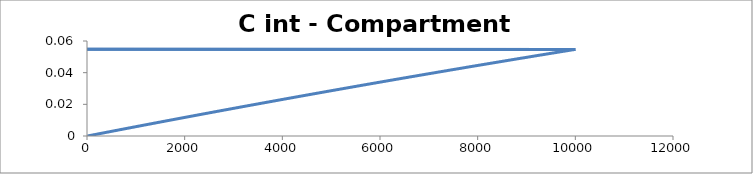
| Category | C - Sys 2 |
|---|---|
| 10.0 | 0 |
| 20.0 | 0 |
| 30.0 | 0 |
| 40.0 | 0 |
| 50.0 | 0 |
| 60.0 | 0 |
| 70.0 | 0 |
| 80.0 | 0 |
| 90.00000000000001 | 0 |
| 100.0 | 0.001 |
| 110.0 | 0.001 |
| 120.0 | 0.001 |
| 130.0 | 0.001 |
| 140.0 | 0.001 |
| 150.0 | 0.001 |
| 160.0 | 0.001 |
| 170.0 | 0.001 |
| 180.00000000000003 | 0.001 |
| 190.0 | 0.001 |
| 200.0 | 0.001 |
| 210.0 | 0.001 |
| 220.0 | 0.001 |
| 230.0 | 0.001 |
| 240.0 | 0.001 |
| 250.0 | 0.001 |
| 260.0 | 0.001 |
| 270.0 | 0.002 |
| 280.0 | 0.002 |
| 290.0 | 0.002 |
| 300.0 | 0.002 |
| 310.0 | 0.002 |
| 320.0 | 0.002 |
| 330.0 | 0.002 |
| 340.0 | 0.002 |
| 350.00000000000006 | 0.002 |
| 360.00000000000006 | 0.002 |
| 370.0 | 0.002 |
| 380.0 | 0.002 |
| 390.0 | 0.002 |
| 400.0 | 0.002 |
| 410.0 | 0.002 |
| 420.0 | 0.002 |
| 430.00000000000006 | 0.003 |
| 440.0 | 0.003 |
| 450.0 | 0.003 |
| 460.0 | 0.003 |
| 470.0 | 0.003 |
| 480.0 | 0.003 |
| 490.0 | 0.003 |
| 500.0 | 0.003 |
| 510.00000000000006 | 0.003 |
| 520.0 | 0.003 |
| 530.0 | 0.003 |
| 540.0 | 0.003 |
| 550.0 | 0.003 |
| 560.0 | 0.003 |
| 570.0 | 0.003 |
| 580.0 | 0.003 |
| 590.0 | 0.003 |
| 600.0 | 0.004 |
| 610.0 | 0.004 |
| 620.0 | 0.004 |
| 630.0 | 0.004 |
| 640.0 | 0.004 |
| 650.0 | 0.004 |
| 660.0 | 0.004 |
| 670.0 | 0.004 |
| 680.0 | 0.004 |
| 690.0000000000001 | 0.004 |
| 700.0000000000001 | 0.004 |
| 710.0000000000001 | 0.004 |
| 720.0000000000001 | 0.004 |
| 730.0 | 0.004 |
| 740.0 | 0.004 |
| 750.0 | 0.004 |
| 760.0 | 0.004 |
| 770.0 | 0.005 |
| 780.0 | 0.005 |
| 790.0 | 0.005 |
| 800.0 | 0.005 |
| 810.0 | 0.005 |
| 820.0 | 0.005 |
| 830.0 | 0.005 |
| 840.0 | 0.005 |
| 850.0000000000001 | 0.005 |
| 860.0000000000001 | 0.005 |
| 870.0000000000001 | 0.005 |
| 880.0 | 0.005 |
| 890.0 | 0.005 |
| 900.0 | 0.005 |
| 910.0 | 0.005 |
| 920.0 | 0.005 |
| 930.0 | 0.005 |
| 940.0 | 0.006 |
| 950.0 | 0.006 |
| 960.0 | 0.006 |
| 970.0 | 0.006 |
| 980.0 | 0.006 |
| 990.0 | 0.006 |
| 1000.0 | 0.006 |
| 1010.0000000000001 | 0.006 |
| 1020.0000000000001 | 0.006 |
| 1030.0 | 0.006 |
| 1040.0 | 0.006 |
| 1050.0 | 0.006 |
| 1060.0 | 0.006 |
| 1070.0 | 0.006 |
| 1080.0 | 0.006 |
| 1090.0 | 0.006 |
| 1100.0 | 0.006 |
| 1110.0 | 0.007 |
| 1120.0 | 0.007 |
| 1130.0 | 0.007 |
| 1140.0 | 0.007 |
| 1150.0 | 0.007 |
| 1160.0 | 0.007 |
| 1170.0 | 0.007 |
| 1180.0 | 0.007 |
| 1190.0 | 0.007 |
| 1200.0 | 0.007 |
| 1210.0 | 0.007 |
| 1220.0 | 0.007 |
| 1230.0 | 0.007 |
| 1240.0 | 0.007 |
| 1250.0 | 0.007 |
| 1260.0 | 0.007 |
| 1270.0 | 0.007 |
| 1280.0 | 0.008 |
| 1290.0 | 0.008 |
| 1300.0 | 0.008 |
| 1310.0 | 0.008 |
| 1320.0 | 0.008 |
| 1330.0 | 0.008 |
| 1340.0 | 0.008 |
| 1350.0 | 0.008 |
| 1360.0 | 0.008 |
| 1370.0 | 0.008 |
| 1380.0000000000002 | 0.008 |
| 1390.0000000000002 | 0.008 |
| 1400.0000000000002 | 0.008 |
| 1410.0000000000002 | 0.008 |
| 1420.0000000000002 | 0.008 |
| 1430.0000000000002 | 0.008 |
| 1440.0000000000002 | 0.008 |
| 1450.0 | 0.009 |
| 1460.0 | 0.009 |
| 1470.0 | 0.009 |
| 1480.0 | 0.009 |
| 1490.0 | 0.009 |
| 1500.0 | 0.009 |
| 1510.0 | 0.009 |
| 1520.0 | 0.009 |
| 1530.0 | 0.009 |
| 1540.0 | 0.009 |
| 1550.0 | 0.009 |
| 1560.0 | 0.009 |
| 1570.0 | 0.009 |
| 1580.0 | 0.009 |
| 1590.0 | 0.009 |
| 1600.0 | 0.009 |
| 1610.0 | 0.009 |
| 1620.0 | 0.01 |
| 1630.0 | 0.01 |
| 1640.0 | 0.01 |
| 1650.0 | 0.01 |
| 1660.0 | 0.01 |
| 1670.0 | 0.01 |
| 1680.0 | 0.01 |
| 1690.0 | 0.01 |
| 1700.0000000000002 | 0.01 |
| 1710.0000000000002 | 0.01 |
| 1720.0000000000002 | 0.01 |
| 1730.0000000000002 | 0.01 |
| 1740.0000000000002 | 0.01 |
| 1750.0000000000002 | 0.01 |
| 1760.0 | 0.01 |
| 1770.0 | 0.01 |
| 1780.0 | 0.01 |
| 1790.0 | 0.011 |
| 1800.0 | 0.011 |
| 1810.0 | 0.011 |
| 1820.0 | 0.011 |
| 1830.0 | 0.011 |
| 1840.0 | 0.011 |
| 1850.0 | 0.011 |
| 1860.0 | 0.011 |
| 1870.0 | 0.011 |
| 1880.0 | 0.011 |
| 1890.0 | 0.011 |
| 1900.0 | 0.011 |
| 1910.0 | 0.011 |
| 1920.0 | 0.011 |
| 1930.0 | 0.011 |
| 1940.0 | 0.011 |
| 1950.0 | 0.011 |
| 1960.0 | 0.011 |
| 1970.0 | 0.012 |
| 1980.0 | 0.012 |
| 1990.0 | 0.012 |
| 2000.0 | 0.012 |
| 2010.0000000000002 | 0.012 |
| 2020.0000000000002 | 0.012 |
| 2030.0000000000002 | 0.012 |
| 2040.0000000000002 | 0.012 |
| 2050.0 | 0.012 |
| 2060.0 | 0.012 |
| 2070.0 | 0.012 |
| 2080.0 | 0.012 |
| 2090.0 | 0.012 |
| 2100.0 | 0.012 |
| 2110.0 | 0.012 |
| 2120.0 | 0.012 |
| 2130.0 | 0.012 |
| 2140.0 | 0.013 |
| 2150.0 | 0.013 |
| 2160.0 | 0.013 |
| 2170.0 | 0.013 |
| 2180.0 | 0.013 |
| 2190.0 | 0.013 |
| 2200.0 | 0.013 |
| 2210.0 | 0.013 |
| 2220.0 | 0.013 |
| 2230.0 | 0.013 |
| 2240.0 | 0.013 |
| 2250.0 | 0.013 |
| 2260.0 | 0.013 |
| 2270.0 | 0.013 |
| 2280.0 | 0.013 |
| 2290.0 | 0.013 |
| 2300.0 | 0.013 |
| 2310.0 | 0.014 |
| 2320.0 | 0.014 |
| 2330.0 | 0.014 |
| 2340.0 | 0.014 |
| 2350.0 | 0.014 |
| 2360.0 | 0.014 |
| 2370.0 | 0.014 |
| 2380.0 | 0.014 |
| 2390.0 | 0.014 |
| 2400.0 | 0.014 |
| 2410.0 | 0.014 |
| 2420.0 | 0.014 |
| 2430.0 | 0.014 |
| 2440.0 | 0.014 |
| 2450.0 | 0.014 |
| 2460.0 | 0.014 |
| 2470.0 | 0.014 |
| 2480.0 | 0.014 |
| 2490.0 | 0.015 |
| 2500.0 | 0.015 |
| 2510.0 | 0.015 |
| 2520.0 | 0.015 |
| 2530.0 | 0.015 |
| 2540.0 | 0.015 |
| 2550.0 | 0.015 |
| 2560.0 | 0.015 |
| 2570.0 | 0.015 |
| 2580.0 | 0.015 |
| 2590.0 | 0.015 |
| 2600.0 | 0.015 |
| 2610.0 | 0.015 |
| 2620.0 | 0.015 |
| 2630.0 | 0.015 |
| 2640.0 | 0.015 |
| 2650.0 | 0.015 |
| 2660.0 | 0.016 |
| 2670.0 | 0.016 |
| 2680.0 | 0.016 |
| 2690.0 | 0.016 |
| 2700.0 | 0.016 |
| 2710.0 | 0.016 |
| 2720.0 | 0.016 |
| 2730.0 | 0.016 |
| 2740.0 | 0.016 |
| 2750.0 | 0.016 |
| 2760.0000000000005 | 0.016 |
| 2770.0000000000005 | 0.016 |
| 2780.0000000000005 | 0.016 |
| 2790.0000000000005 | 0.016 |
| 2800.0000000000005 | 0.016 |
| 2810.0000000000005 | 0.016 |
| 2820.0000000000005 | 0.016 |
| 2830.0000000000005 | 0.016 |
| 2840.0000000000005 | 0.017 |
| 2850.0000000000005 | 0.017 |
| 2860.0000000000005 | 0.017 |
| 2870.0000000000005 | 0.017 |
| 2880.0000000000005 | 0.017 |
| 2890.0 | 0.017 |
| 2900.0 | 0.017 |
| 2910.0 | 0.017 |
| 2920.0 | 0.017 |
| 2930.0 | 0.017 |
| 2940.0 | 0.017 |
| 2950.0 | 0.017 |
| 2960.0 | 0.017 |
| 2970.0 | 0.017 |
| 2980.0 | 0.017 |
| 2990.0 | 0.017 |
| 3000.0 | 0.017 |
| 3010.0 | 0.018 |
| 3020.0 | 0.018 |
| 3030.0 | 0.018 |
| 3040.0 | 0.018 |
| 3050.0 | 0.018 |
| 3060.0 | 0.018 |
| 3070.0 | 0.018 |
| 3080.0 | 0.018 |
| 3090.0 | 0.018 |
| 3100.0 | 0.018 |
| 3110.0 | 0.018 |
| 3120.0 | 0.018 |
| 3130.0 | 0.018 |
| 3140.0 | 0.018 |
| 3150.0 | 0.018 |
| 3160.0 | 0.018 |
| 3170.0 | 0.018 |
| 3180.0 | 0.018 |
| 3190.0 | 0.019 |
| 3200.0 | 0.019 |
| 3210.0 | 0.019 |
| 3220.0 | 0.019 |
| 3230.0 | 0.019 |
| 3240.0 | 0.019 |
| 3250.0 | 0.019 |
| 3260.0 | 0.019 |
| 3270.0 | 0.019 |
| 3280.0 | 0.019 |
| 3290.0 | 0.019 |
| 3300.0 | 0.019 |
| 3310.0 | 0.019 |
| 3320.0 | 0.019 |
| 3330.0 | 0.019 |
| 3340.0 | 0.019 |
| 3350.0 | 0.019 |
| 3360.0 | 0.019 |
| 3370.0 | 0.02 |
| 3380.0 | 0.02 |
| 3390.0000000000005 | 0.02 |
| 3400.0000000000005 | 0.02 |
| 3410.0000000000005 | 0.02 |
| 3420.0000000000005 | 0.02 |
| 3430.0000000000005 | 0.02 |
| 3440.0000000000005 | 0.02 |
| 3450.0000000000005 | 0.02 |
| 3460.0000000000005 | 0.02 |
| 3470.0000000000005 | 0.02 |
| 3480.0000000000005 | 0.02 |
| 3490.0000000000005 | 0.02 |
| 3500.0000000000005 | 0.02 |
| 3510.0000000000005 | 0.02 |
| 3520.0 | 0.02 |
| 3530.0 | 0.02 |
| 3540.0 | 0.021 |
| 3550.0 | 0.021 |
| 3560.0 | 0.021 |
| 3570.0 | 0.021 |
| 3580.0 | 0.021 |
| 3590.0 | 0.021 |
| 3600.0 | 0.021 |
| 3610.0 | 0.021 |
| 3620.0 | 0.021 |
| 3630.0 | 0.021 |
| 3640.0 | 0.021 |
| 3650.0 | 0.021 |
| 3660.0 | 0.021 |
| 3670.0 | 0.021 |
| 3680.0 | 0.021 |
| 3690.0 | 0.021 |
| 3700.0 | 0.021 |
| 3710.0 | 0.021 |
| 3720.0 | 0.022 |
| 3730.0 | 0.022 |
| 3740.0 | 0.022 |
| 3750.0 | 0.022 |
| 3760.0 | 0.022 |
| 3770.0 | 0.022 |
| 3780.0 | 0.022 |
| 3790.0 | 0.022 |
| 3800.0 | 0.022 |
| 3810.0 | 0.022 |
| 3820.0 | 0.022 |
| 3830.0 | 0.022 |
| 3840.0 | 0.022 |
| 3850.0 | 0.022 |
| 3860.0 | 0.022 |
| 3870.0 | 0.022 |
| 3880.0 | 0.022 |
| 3890.0 | 0.022 |
| 3900.0 | 0.023 |
| 3910.0 | 0.023 |
| 3920.0 | 0.023 |
| 3930.0 | 0.023 |
| 3940.0 | 0.023 |
| 3950.0 | 0.023 |
| 3960.0 | 0.023 |
| 3970.0 | 0.023 |
| 3980.0 | 0.023 |
| 3990.0 | 0.023 |
| 4000.0 | 0.023 |
| 4010.0000000000005 | 0.023 |
| 4020.0000000000005 | 0.023 |
| 4030.0000000000005 | 0.023 |
| 4040.0000000000005 | 0.023 |
| 4050.0000000000005 | 0.023 |
| 4060.0000000000005 | 0.023 |
| 4070.0000000000005 | 0.023 |
| 4080.0000000000005 | 0.024 |
| 4090.0000000000005 | 0.024 |
| 4100.0 | 0.024 |
| 4110.0 | 0.024 |
| 4120.0 | 0.024 |
| 4130.0 | 0.024 |
| 4140.0 | 0.024 |
| 4150.0 | 0.024 |
| 4160.0 | 0.024 |
| 4170.0 | 0.024 |
| 4180.0 | 0.024 |
| 4190.0 | 0.024 |
| 4200.0 | 0.024 |
| 4210.0 | 0.024 |
| 4220.0 | 0.024 |
| 4230.0 | 0.024 |
| 4240.0 | 0.024 |
| 4250.0 | 0.024 |
| 4260.0 | 0.025 |
| 4270.0 | 0.025 |
| 4280.0 | 0.025 |
| 4290.0 | 0.025 |
| 4300.0 | 0.025 |
| 4310.0 | 0.025 |
| 4320.0 | 0.025 |
| 4330.0 | 0.025 |
| 4340.0 | 0.025 |
| 4350.0 | 0.025 |
| 4360.0 | 0.025 |
| 4370.0 | 0.025 |
| 4380.0 | 0.025 |
| 4390.0 | 0.025 |
| 4400.0 | 0.025 |
| 4410.0 | 0.025 |
| 4420.0 | 0.025 |
| 4430.0 | 0.025 |
| 4440.0 | 0.026 |
| 4450.0 | 0.026 |
| 4460.0 | 0.026 |
| 4470.0 | 0.026 |
| 4480.0 | 0.026 |
| 4490.0 | 0.026 |
| 4500.0 | 0.026 |
| 4510.0 | 0.026 |
| 4520.0 | 0.026 |
| 4530.0 | 0.026 |
| 4540.0 | 0.026 |
| 4550.0 | 0.026 |
| 4560.0 | 0.026 |
| 4570.0 | 0.026 |
| 4580.0 | 0.026 |
| 4590.0 | 0.026 |
| 4600.0 | 0.026 |
| 4610.0 | 0.026 |
| 4620.0 | 0.027 |
| 4630.0 | 0.027 |
| 4640.0 | 0.027 |
| 4650.0 | 0.027 |
| 4660.0 | 0.027 |
| 4670.0 | 0.027 |
| 4680.0 | 0.027 |
| 4690.0 | 0.027 |
| 4700.0 | 0.027 |
| 4710.0 | 0.027 |
| 4720.0 | 0.027 |
| 4730.0 | 0.027 |
| 4740.0 | 0.027 |
| 4750.0 | 0.027 |
| 4760.0 | 0.027 |
| 4770.0 | 0.027 |
| 4780.0 | 0.027 |
| 4790.0 | 0.027 |
| 4800.0 | 0.027 |
| 4810.0 | 0.028 |
| 4820.0 | 0.028 |
| 4830.0 | 0.028 |
| 4840.0 | 0.028 |
| 4850.0 | 0.028 |
| 4860.0 | 0.028 |
| 4870.0 | 0.028 |
| 4880.0 | 0.028 |
| 4890.0 | 0.028 |
| 4900.0 | 0.028 |
| 4910.0 | 0.028 |
| 4920.0 | 0.028 |
| 4930.0 | 0.028 |
| 4940.0 | 0.028 |
| 4950.0 | 0.028 |
| 4960.0 | 0.028 |
| 4970.0 | 0.028 |
| 4980.0 | 0.028 |
| 4990.0 | 0.029 |
| 5000.0 | 0.029 |
| 5010.0 | 0.029 |
| 5020.0 | 0.029 |
| 5030.0 | 0.029 |
| 5040.0 | 0.029 |
| 5050.0 | 0.029 |
| 5060.0 | 0.029 |
| 5070.0 | 0.029 |
| 5080.0 | 0.029 |
| 5090.0 | 0.029 |
| 5100.0 | 0.029 |
| 5110.0 | 0.029 |
| 5120.0 | 0.029 |
| 5130.0 | 0.029 |
| 5140.0 | 0.029 |
| 5150.0 | 0.029 |
| 5160.0 | 0.029 |
| 5170.0 | 0.03 |
| 5180.0 | 0.03 |
| 5190.0 | 0.03 |
| 5200.0 | 0.03 |
| 5210.0 | 0.03 |
| 5220.0 | 0.03 |
| 5230.0 | 0.03 |
| 5240.0 | 0.03 |
| 5250.0 | 0.03 |
| 5260.0 | 0.03 |
| 5270.0 | 0.03 |
| 5280.0 | 0.03 |
| 5290.0 | 0.03 |
| 5300.0 | 0.03 |
| 5310.0 | 0.03 |
| 5320.0 | 0.03 |
| 5330.0 | 0.03 |
| 5340.0 | 0.03 |
| 5350.0 | 0.031 |
| 5360.0 | 0.031 |
| 5370.0 | 0.031 |
| 5380.0 | 0.031 |
| 5390.0 | 0.031 |
| 5400.0 | 0.031 |
| 5410.0 | 0.031 |
| 5420.0 | 0.031 |
| 5430.0 | 0.031 |
| 5440.0 | 0.031 |
| 5450.0 | 0.031 |
| 5460.0 | 0.031 |
| 5470.0 | 0.031 |
| 5480.0 | 0.031 |
| 5490.0 | 0.031 |
| 5500.0 | 0.031 |
| 5510.0 | 0.031 |
| 5520.000000000001 | 0.031 |
| 5530.000000000001 | 0.031 |
| 5540.000000000001 | 0.032 |
| 5550.000000000001 | 0.032 |
| 5560.000000000001 | 0.032 |
| 5570.000000000001 | 0.032 |
| 5580.000000000001 | 0.032 |
| 5590.000000000001 | 0.032 |
| 5600.000000000001 | 0.032 |
| 5610.000000000001 | 0.032 |
| 5620.000000000001 | 0.032 |
| 5630.000000000001 | 0.032 |
| 5640.000000000001 | 0.032 |
| 5650.000000000001 | 0.032 |
| 5660.000000000001 | 0.032 |
| 5670.000000000001 | 0.032 |
| 5680.000000000001 | 0.032 |
| 5690.000000000001 | 0.032 |
| 5700.000000000001 | 0.032 |
| 5710.000000000001 | 0.032 |
| 5720.000000000001 | 0.033 |
| 5730.000000000001 | 0.033 |
| 5740.000000000001 | 0.033 |
| 5750.000000000001 | 0.033 |
| 5760.000000000001 | 0.033 |
| 5770.0 | 0.033 |
| 5780.0 | 0.033 |
| 5790.0 | 0.033 |
| 5800.0 | 0.033 |
| 5810.0 | 0.033 |
| 5820.0 | 0.033 |
| 5830.0 | 0.033 |
| 5840.0 | 0.033 |
| 5850.0 | 0.033 |
| 5860.0 | 0.033 |
| 5870.0 | 0.033 |
| 5880.0 | 0.033 |
| 5890.0 | 0.033 |
| 5900.0 | 0.033 |
| 5910.0 | 0.034 |
| 5920.0 | 0.034 |
| 5930.0 | 0.034 |
| 5940.0 | 0.034 |
| 5950.0 | 0.034 |
| 5960.0 | 0.034 |
| 5970.0 | 0.034 |
| 5980.0 | 0.034 |
| 5990.0 | 0.034 |
| 6000.0 | 0.034 |
| 6010.0 | 0.034 |
| 6020.0 | 0.034 |
| 6030.0 | 0.034 |
| 6040.0 | 0.034 |
| 6050.0 | 0.034 |
| 6060.0 | 0.034 |
| 6070.0 | 0.034 |
| 6080.0 | 0.034 |
| 6090.0 | 0.034 |
| 6100.0 | 0.035 |
| 6110.0 | 0.035 |
| 6120.0 | 0.035 |
| 6130.0 | 0.035 |
| 6140.0 | 0.035 |
| 6150.0 | 0.035 |
| 6160.0 | 0.035 |
| 6170.0 | 0.035 |
| 6180.0 | 0.035 |
| 6190.0 | 0.035 |
| 6200.0 | 0.035 |
| 6210.0 | 0.035 |
| 6220.0 | 0.035 |
| 6230.0 | 0.035 |
| 6240.0 | 0.035 |
| 6250.0 | 0.035 |
| 6260.0 | 0.035 |
| 6270.0 | 0.035 |
| 6280.0 | 0.036 |
| 6290.0 | 0.036 |
| 6300.0 | 0.036 |
| 6310.0 | 0.036 |
| 6320.0 | 0.036 |
| 6330.0 | 0.036 |
| 6340.0 | 0.036 |
| 6350.0 | 0.036 |
| 6360.0 | 0.036 |
| 6370.0 | 0.036 |
| 6380.0 | 0.036 |
| 6390.0 | 0.036 |
| 6400.0 | 0.036 |
| 6410.0 | 0.036 |
| 6420.0 | 0.036 |
| 6430.0 | 0.036 |
| 6440.0 | 0.036 |
| 6450.0 | 0.036 |
| 6460.0 | 0.036 |
| 6470.0 | 0.037 |
| 6480.0 | 0.037 |
| 6490.0 | 0.037 |
| 6500.0 | 0.037 |
| 6510.0 | 0.037 |
| 6520.0 | 0.037 |
| 6530.0 | 0.037 |
| 6540.0 | 0.037 |
| 6550.0 | 0.037 |
| 6560.0 | 0.037 |
| 6570.0 | 0.037 |
| 6580.0 | 0.037 |
| 6590.0 | 0.037 |
| 6600.0 | 0.037 |
| 6610.0 | 0.037 |
| 6620.0 | 0.037 |
| 6630.0 | 0.037 |
| 6640.0 | 0.037 |
| 6650.0 | 0.037 |
| 6660.0 | 0.038 |
| 6670.0 | 0.038 |
| 6680.0 | 0.038 |
| 6690.0 | 0.038 |
| 6700.0 | 0.038 |
| 6710.0 | 0.038 |
| 6720.0 | 0.038 |
| 6730.0 | 0.038 |
| 6740.0 | 0.038 |
| 6750.0 | 0.038 |
| 6760.0 | 0.038 |
| 6770.000000000001 | 0.038 |
| 6780.000000000001 | 0.038 |
| 6790.000000000001 | 0.038 |
| 6800.000000000001 | 0.038 |
| 6810.000000000001 | 0.038 |
| 6820.000000000001 | 0.038 |
| 6830.000000000001 | 0.038 |
| 6840.000000000001 | 0.038 |
| 6850.000000000001 | 0.039 |
| 6860.000000000001 | 0.039 |
| 6870.000000000001 | 0.039 |
| 6880.000000000001 | 0.039 |
| 6890.000000000001 | 0.039 |
| 6900.000000000001 | 0.039 |
| 6910.000000000001 | 0.039 |
| 6920.000000000001 | 0.039 |
| 6930.000000000001 | 0.039 |
| 6940.000000000001 | 0.039 |
| 6950.000000000001 | 0.039 |
| 6960.000000000001 | 0.039 |
| 6970.000000000001 | 0.039 |
| 6980.000000000001 | 0.039 |
| 6990.000000000001 | 0.039 |
| 7000.000000000001 | 0.039 |
| 7010.000000000001 | 0.039 |
| 7020.000000000001 | 0.039 |
| 7030.000000000001 | 0.039 |
| 7040.0 | 0.04 |
| 7050.0 | 0.04 |
| 7060.0 | 0.04 |
| 7070.0 | 0.04 |
| 7080.0 | 0.04 |
| 7090.0 | 0.04 |
| 7100.0 | 0.04 |
| 7110.0 | 0.04 |
| 7120.0 | 0.04 |
| 7130.0 | 0.04 |
| 7140.0 | 0.04 |
| 7150.0 | 0.04 |
| 7160.0 | 0.04 |
| 7170.0 | 0.04 |
| 7180.0 | 0.04 |
| 7190.0 | 0.04 |
| 7200.0 | 0.04 |
| 7210.0 | 0.04 |
| 7220.0 | 0.04 |
| 7230.0 | 0.041 |
| 7240.0 | 0.041 |
| 7250.0 | 0.041 |
| 7260.0 | 0.041 |
| 7270.0 | 0.041 |
| 7280.0 | 0.041 |
| 7290.0 | 0.041 |
| 7300.0 | 0.041 |
| 7310.0 | 0.041 |
| 7320.0 | 0.041 |
| 7330.0 | 0.041 |
| 7340.0 | 0.041 |
| 7350.0 | 0.041 |
| 7360.0 | 0.041 |
| 7370.0 | 0.041 |
| 7380.0 | 0.041 |
| 7390.0 | 0.041 |
| 7400.0 | 0.041 |
| 7410.0 | 0.041 |
| 7420.0 | 0.042 |
| 7430.0 | 0.042 |
| 7440.0 | 0.042 |
| 7450.0 | 0.042 |
| 7460.0 | 0.042 |
| 7470.0 | 0.042 |
| 7480.0 | 0.042 |
| 7490.0 | 0.042 |
| 7500.0 | 0.042 |
| 7510.0 | 0.042 |
| 7520.0 | 0.042 |
| 7530.0 | 0.042 |
| 7540.0 | 0.042 |
| 7550.0 | 0.042 |
| 7560.0 | 0.042 |
| 7570.0 | 0.042 |
| 7580.0 | 0.042 |
| 7590.0 | 0.042 |
| 7600.0 | 0.042 |
| 7610.0 | 0.043 |
| 7620.0 | 0.043 |
| 7630.0 | 0.043 |
| 7640.0 | 0.043 |
| 7650.0 | 0.043 |
| 7660.0 | 0.043 |
| 7670.0 | 0.043 |
| 7680.0 | 0.043 |
| 7690.0 | 0.043 |
| 7700.0 | 0.043 |
| 7710.0 | 0.043 |
| 7720.0 | 0.043 |
| 7730.0 | 0.043 |
| 7740.0 | 0.043 |
| 7750.0 | 0.043 |
| 7760.0 | 0.043 |
| 7770.0 | 0.043 |
| 7780.0 | 0.043 |
| 7790.0 | 0.043 |
| 7800.0 | 0.044 |
| 7810.0 | 0.044 |
| 7820.0 | 0.044 |
| 7830.0 | 0.044 |
| 7840.0 | 0.044 |
| 7850.0 | 0.044 |
| 7860.0 | 0.044 |
| 7870.0 | 0.044 |
| 7880.0 | 0.044 |
| 7890.0 | 0.044 |
| 7900.0 | 0.044 |
| 7910.0 | 0.044 |
| 7920.0 | 0.044 |
| 7930.0 | 0.044 |
| 7940.0 | 0.044 |
| 7950.0 | 0.044 |
| 7960.0 | 0.044 |
| 7970.0 | 0.044 |
| 7980.0 | 0.044 |
| 7990.0 | 0.045 |
| 8000.0 | 0.045 |
| 8010.0 | 0.045 |
| 8020.000000000001 | 0.045 |
| 8030.000000000001 | 0.045 |
| 8040.000000000001 | 0.045 |
| 8050.000000000001 | 0.045 |
| 8060.000000000001 | 0.045 |
| 8070.000000000001 | 0.045 |
| 8080.000000000001 | 0.045 |
| 8090.000000000001 | 0.045 |
| 8100.000000000001 | 0.045 |
| 8110.000000000001 | 0.045 |
| 8120.000000000001 | 0.045 |
| 8130.000000000001 | 0.045 |
| 8140.000000000001 | 0.045 |
| 8150.000000000001 | 0.045 |
| 8160.000000000001 | 0.045 |
| 8170.000000000001 | 0.045 |
| 8180.000000000001 | 0.045 |
| 8190.000000000001 | 0.046 |
| 8200.0 | 0.046 |
| 8210.0 | 0.046 |
| 8220.0 | 0.046 |
| 8230.0 | 0.046 |
| 8240.0 | 0.046 |
| 8250.0 | 0.046 |
| 8260.0 | 0.046 |
| 8270.0 | 0.046 |
| 8280.0 | 0.046 |
| 8290.0 | 0.046 |
| 8300.0 | 0.046 |
| 8310.0 | 0.046 |
| 8320.0 | 0.046 |
| 8330.0 | 0.046 |
| 8340.0 | 0.046 |
| 8350.0 | 0.046 |
| 8360.0 | 0.046 |
| 8370.0 | 0.046 |
| 8380.0 | 0.047 |
| 8390.0 | 0.047 |
| 8400.0 | 0.047 |
| 8410.0 | 0.047 |
| 8420.0 | 0.047 |
| 8430.0 | 0.047 |
| 8440.0 | 0.047 |
| 8450.0 | 0.047 |
| 8460.0 | 0.047 |
| 8470.0 | 0.047 |
| 8480.0 | 0.047 |
| 8490.0 | 0.047 |
| 8500.0 | 0.047 |
| 8510.0 | 0.047 |
| 8520.0 | 0.047 |
| 8530.0 | 0.047 |
| 8540.0 | 0.047 |
| 8550.0 | 0.047 |
| 8560.0 | 0.047 |
| 8570.0 | 0.047 |
| 8580.0 | 0.048 |
| 8590.0 | 0.048 |
| 8600.0 | 0.048 |
| 8610.0 | 0.048 |
| 8620.0 | 0.048 |
| 8630.0 | 0.048 |
| 8640.0 | 0.048 |
| 8650.0 | 0.048 |
| 8660.0 | 0.048 |
| 8670.0 | 0.048 |
| 8680.0 | 0.048 |
| 8690.0 | 0.048 |
| 8700.0 | 0.048 |
| 8710.0 | 0.048 |
| 8720.0 | 0.048 |
| 8730.0 | 0.048 |
| 8740.0 | 0.048 |
| 8750.0 | 0.048 |
| 8760.0 | 0.048 |
| 8770.0 | 0.049 |
| 8780.0 | 0.049 |
| 8790.0 | 0.049 |
| 8800.0 | 0.049 |
| 8810.0 | 0.049 |
| 8820.0 | 0.049 |
| 8830.0 | 0.049 |
| 8840.0 | 0.049 |
| 8850.0 | 0.049 |
| 8860.0 | 0.049 |
| 8870.0 | 0.049 |
| 8880.0 | 0.049 |
| 8890.0 | 0.049 |
| 8900.0 | 0.049 |
| 8910.0 | 0.049 |
| 8920.0 | 0.049 |
| 8930.0 | 0.049 |
| 8940.0 | 0.049 |
| 8950.0 | 0.049 |
| 8960.0 | 0.049 |
| 8970.0 | 0.05 |
| 8980.0 | 0.05 |
| 8990.0 | 0.05 |
| 9000.0 | 0.05 |
| 9010.0 | 0.05 |
| 9020.0 | 0.05 |
| 9030.0 | 0.05 |
| 9040.0 | 0.05 |
| 9050.0 | 0.05 |
| 9060.0 | 0.05 |
| 9070.0 | 0.05 |
| 9080.0 | 0.05 |
| 9090.0 | 0.05 |
| 9100.0 | 0.05 |
| 9110.0 | 0.05 |
| 9120.0 | 0.05 |
| 9130.0 | 0.05 |
| 9140.0 | 0.05 |
| 9150.0 | 0.05 |
| 9160.0 | 0.05 |
| 9170.0 | 0.051 |
| 9180.0 | 0.051 |
| 9190.0 | 0.051 |
| 9200.0 | 0.051 |
| 9210.0 | 0.051 |
| 9220.0 | 0.051 |
| 9230.0 | 0.051 |
| 9240.0 | 0.051 |
| 9250.0 | 0.051 |
| 9260.0 | 0.051 |
| 9270.0 | 0.051 |
| 9280.0 | 0.051 |
| 9290.0 | 0.051 |
| 9300.0 | 0.051 |
| 9310.0 | 0.051 |
| 9320.0 | 0.051 |
| 9330.0 | 0.051 |
| 9340.0 | 0.051 |
| 9350.0 | 0.051 |
| 9360.0 | 0.052 |
| 9370.0 | 0.052 |
| 9380.0 | 0.052 |
| 9390.0 | 0.052 |
| 9400.0 | 0.052 |
| 9410.0 | 0.052 |
| 9420.0 | 0.052 |
| 9430.0 | 0.052 |
| 9440.0 | 0.052 |
| 9450.0 | 0.052 |
| 9460.0 | 0.052 |
| 9470.0 | 0.052 |
| 9480.0 | 0.052 |
| 9490.0 | 0.052 |
| 9500.0 | 0.052 |
| 9510.0 | 0.052 |
| 9520.0 | 0.052 |
| 9530.0 | 0.052 |
| 9540.0 | 0.052 |
| 9550.0 | 0.052 |
| 9560.0 | 0.053 |
| 9570.0 | 0.053 |
| 9580.0 | 0.053 |
| 9590.0 | 0.053 |
| 9600.0 | 0.053 |
| 9610.0 | 0.053 |
| 9620.0 | 0.053 |
| 9630.0 | 0.053 |
| 9640.0 | 0.053 |
| 9650.0 | 0.053 |
| 9660.0 | 0.053 |
| 9670.0 | 0.053 |
| 9680.0 | 0.053 |
| 9690.0 | 0.053 |
| 9700.0 | 0.053 |
| 9710.0 | 0.053 |
| 9720.0 | 0.053 |
| 9730.0 | 0.053 |
| 9740.0 | 0.053 |
| 9750.0 | 0.053 |
| 9760.0 | 0.054 |
| 9770.0 | 0.054 |
| 9780.0 | 0.054 |
| 9790.0 | 0.054 |
| 9800.0 | 0.054 |
| 9810.0 | 0.054 |
| 9820.0 | 0.054 |
| 9830.0 | 0.054 |
| 9840.0 | 0.054 |
| 9850.0 | 0.054 |
| 9860.0 | 0.054 |
| 9870.0 | 0.054 |
| 9880.0 | 0.054 |
| 9890.0 | 0.054 |
| 9900.0 | 0.054 |
| 9910.0 | 0.054 |
| 9920.0 | 0.054 |
| 9930.0 | 0.054 |
| 9940.0 | 0.054 |
| 9950.0 | 0.054 |
| 9960.0 | 0.055 |
| 9970.0 | 0.055 |
| 9980.0 | 0.055 |
| 9990.0 | 0.055 |
| 10000.0 | 0.055 |